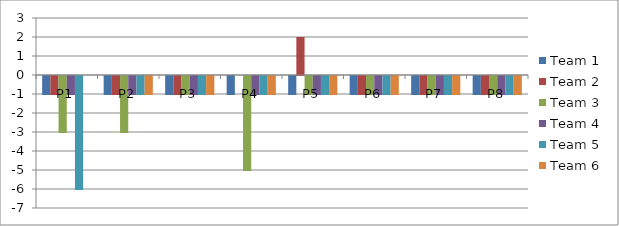
| Category | Team 1 | Team 2 | Team 3 | Team 4 | Team 5 | Team 6 |
|---|---|---|---|---|---|---|
| P1 | -1 | -1 | -3 | -1 | -6 | 0 |
| P2 | -1 | -1 | -3 | -1 | -1 | -1 |
| P3 | -1 | -1 | -1 | -1 | -1 | -1 |
| P4 | -1 | 0 | -5 | -1 | -1 | -1 |
| P5 | -1 | 2 | -1 | -1 | -1 | -1 |
| P6 | -1 | -1 | -1 | -1 | -1 | -1 |
| P7 | -1 | -1 | -1 | -1 | -1 | -1 |
| P8 | -1 | -1 | -1 | -1 | -1 | -1 |